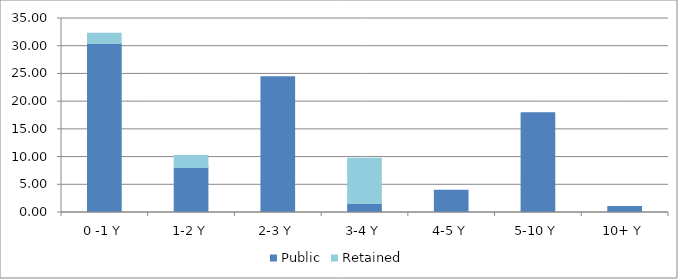
| Category | Public | Retained |
|---|---|---|
| 0 -1 Y | 30.483 | 1.852 |
| 1-2 Y | 8.125 | 2.176 |
| 2-3 Y | 24.484 | 0 |
| 3-4 Y | 1.632 | 8.161 |
| 4-5 Y | 4.019 | 0 |
| 5-10 Y | 17.978 | 0 |
| 10+ Y | 1.088 | 0 |